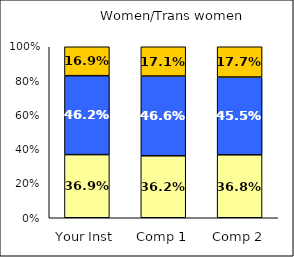
| Category | Low Diversity Climate | Average Diversity Climate | High Diversity Climate |
|---|---|---|---|
| Your Inst | 0.369 | 0.462 | 0.169 |
| Comp 1 | 0.362 | 0.466 | 0.171 |
| Comp 2 | 0.368 | 0.455 | 0.177 |